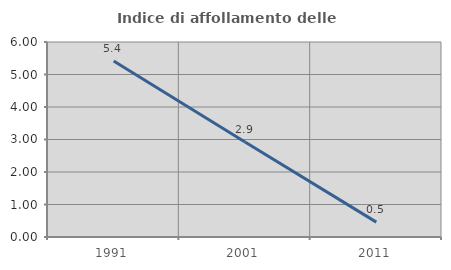
| Category | Indice di affollamento delle abitazioni  |
|---|---|
| 1991.0 | 5.414 |
| 2001.0 | 2.922 |
| 2011.0 | 0.457 |